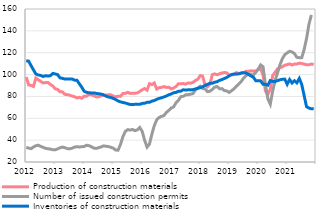
| Category | Production of construction materials |
|---|---|
| 2012-01-01 | 97.766 |
| 2012-02-01 | 90.572 |
| 2012-03-01 | 90.08 |
| 2012-04-01 | 89.077 |
| 2012-05-01 | 96.829 |
| 2012-06-01 | 95.266 |
| 2012-07-01 | 93.752 |
| 2012-08-01 | 92.34 |
| 2012-09-01 | 92.655 |
| 2012-10-01 | 92.78 |
| 2012-11-01 | 90.967 |
| 2012-12-01 | 89.549 |
| 2013-01-01 | 87.007 |
| 2013-02-01 | 86.387 |
| 2013-03-01 | 84.281 |
| 2013-04-01 | 84.17 |
| 2013-05-01 | 81.94 |
| 2013-06-01 | 81.641 |
| 2013-07-01 | 81.118 |
| 2013-08-01 | 80.31 |
| 2013-09-01 | 79.733 |
| 2013-10-01 | 78.665 |
| 2013-11-01 | 79.208 |
| 2013-12-01 | 78.296 |
| 2014-01-01 | 80.272 |
| 2014-02-01 | 80.2 |
| 2014-03-01 | 81.927 |
| 2014-04-01 | 81.432 |
| 2014-05-01 | 80.598 |
| 2014-06-01 | 79.587 |
| 2014-07-01 | 79.741 |
| 2014-08-01 | 80.695 |
| 2014-09-01 | 81.076 |
| 2014-10-01 | 81.1 |
| 2014-11-01 | 81.552 |
| 2014-12-01 | 81.481 |
| 2015-01-01 | 80.406 |
| 2015-02-01 | 79.651 |
| 2015-03-01 | 80.22 |
| 2015-04-01 | 80.065 |
| 2015-05-01 | 82.586 |
| 2015-06-01 | 82.792 |
| 2015-07-01 | 83.729 |
| 2015-08-01 | 82.761 |
| 2015-09-01 | 83.003 |
| 2015-10-01 | 82.918 |
| 2015-11-01 | 83.263 |
| 2015-12-01 | 84.623 |
| 2016-01-01 | 86.083 |
| 2016-02-01 | 87.219 |
| 2016-03-01 | 85.705 |
| 2016-04-01 | 91.724 |
| 2016-05-01 | 90.811 |
| 2016-06-01 | 92.331 |
| 2016-07-01 | 86.816 |
| 2016-08-01 | 87.989 |
| 2016-09-01 | 88.303 |
| 2016-10-01 | 88.971 |
| 2016-11-01 | 88.24 |
| 2016-12-01 | 88.45 |
| 2017-01-01 | 86.887 |
| 2017-02-01 | 87.69 |
| 2017-03-01 | 89.145 |
| 2017-04-01 | 91.657 |
| 2017-05-01 | 91.618 |
| 2017-06-01 | 91.765 |
| 2017-07-01 | 91.229 |
| 2017-08-01 | 92.344 |
| 2017-09-01 | 92.099 |
| 2017-10-01 | 92.861 |
| 2017-11-01 | 94.518 |
| 2017-12-01 | 95.728 |
| 2018-01-01 | 99.065 |
| 2018-02-01 | 98.597 |
| 2018-03-01 | 90.538 |
| 2018-04-01 | 88.777 |
| 2018-05-01 | 91.01 |
| 2018-06-01 | 99.855 |
| 2018-07-01 | 100.634 |
| 2018-08-01 | 99.797 |
| 2018-09-01 | 100.733 |
| 2018-10-31 | 101.462 |
| 2018-11-30 | 101.869 |
| 2018-12-31 | 101.525 |
| 2019-01-31 | 99.347 |
| 2019-02-28 | 99.899 |
| 2019-03-31 | 99.866 |
| 2019-04-30 | 101.771 |
| 2019-05-31 | 100.907 |
| 2019-06-30 | 101.154 |
| 2019-07-31 | 101.72 |
| 2019-08-31 | 103.031 |
| 2019-09-30 | 103.008 |
| 2019-10-31 | 103.447 |
| 2019-11-30 | 103.206 |
| 2019-12-31 | 103.244 |
| 2020-01-31 | 104.717 |
| 2020-02-29 | 105.32 |
| 2020-03-31 | 99.539 |
| 2020-04-30 | 84.917 |
| 2020-05-31 | 81.886 |
| 2020-06-30 | 86.605 |
| 2020-07-31 | 99.146 |
| 2020-08-31 | 102.151 |
| 2020-09-30 | 105.248 |
| 2020-10-31 | 106.286 |
| 2020-11-30 | 107.099 |
| 2020-12-31 | 108.607 |
| 2021-01-31 | 109.095 |
| 2021-02-28 | 109.739 |
| 2021-03-31 | 108.759 |
| 2021-04-30 | 109.605 |
| 2021-05-31 | 109.669 |
| 2021-06-30 | 110.402 |
| 2021-07-31 | 110.168 |
| 2021-08-31 | 109.585 |
| 2021-09-30 | 108.935 |
| 2021-10-31 | 109.013 |
| 2021-11-30 | 109.604 |
| 2021-12-31 | 109.426 |